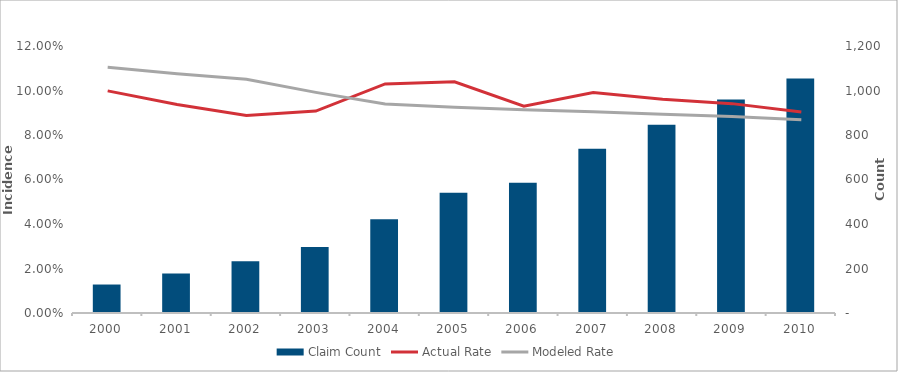
| Category | Claim Count |
|---|---|
| 2000.0 | 128 |
| 2001.0 | 177 |
| 2002.0 | 233 |
| 2003.0 | 297 |
| 2004.0 | 421 |
| 2005.0 | 541 |
| 2006.0 | 585 |
| 2007.0 | 738 |
| 2008.0 | 846 |
| 2009.0 | 960 |
| 2010.0 | 1054 |